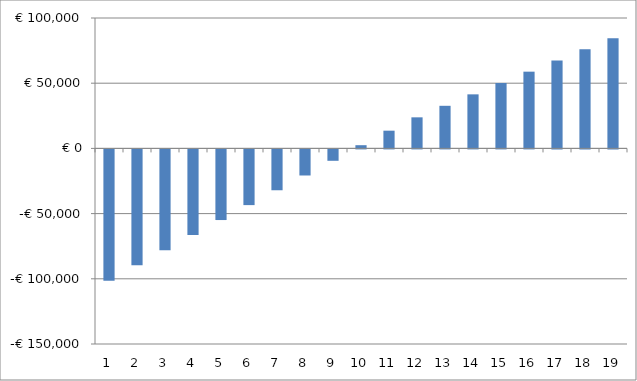
| Category | Series 0 |
|---|---|
| 0 | -100660.794 |
| 1 | -88936.659 |
| 2 | -77281.6 |
| 3 | -65694.608 |
| 4 | -54174.676 |
| 5 | -42720.797 |
| 6 | -31331.965 |
| 7 | -20007.178 |
| 8 | -8745.43 |
| 9 | 2454.282 |
| 10 | 13592.96 |
| 11 | 23824.596 |
| 12 | 32666.186 |
| 13 | 41449.752 |
| 14 | 50176.297 |
| 15 | 58846.825 |
| 16 | 67462.34 |
| 17 | 76023.849 |
| 18 | 84532.358 |